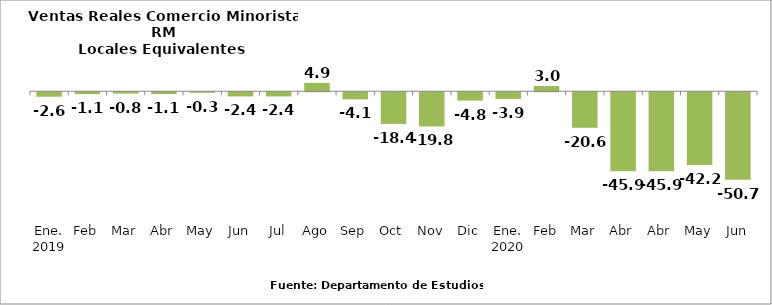
| Category | Series 0 |
|---|---|
| Ene. 2019 | -2.6 |
| Feb | -1.069 |
| Mar | -0.805 |
| Abr | -1.059 |
| May | -0.317 |
| Jun | -2.443 |
| Jul | -2.435 |
| Ago | 4.875 |
| Sep | -4.13 |
| Oct | -18.361 |
| Nov | -19.822 |
| Dic | -4.831 |
| Ene. 2020 | -3.881 |
| Feb | 3.048 |
| Mar | -20.555 |
| Abr | -45.863 |
| Abr | -45.863 |
| May | -42.184 |
| Jun | -50.735 |